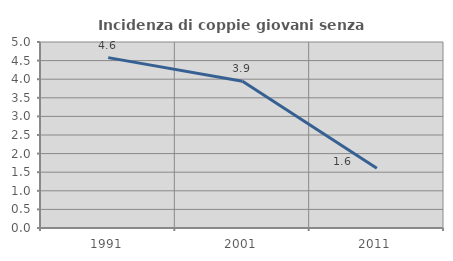
| Category | Incidenza di coppie giovani senza figli |
|---|---|
| 1991.0 | 4.58 |
| 2001.0 | 3.947 |
| 2011.0 | 1.608 |